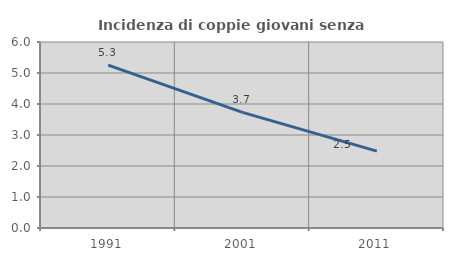
| Category | Incidenza di coppie giovani senza figli |
|---|---|
| 1991.0 | 5.253 |
| 2001.0 | 3.728 |
| 2011.0 | 2.48 |